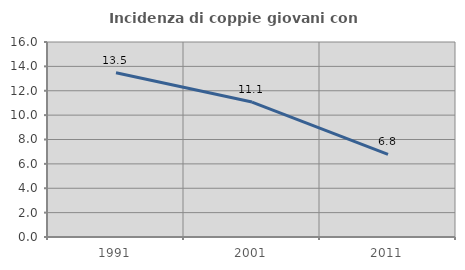
| Category | Incidenza di coppie giovani con figli |
|---|---|
| 1991.0 | 13.479 |
| 2001.0 | 11.073 |
| 2011.0 | 6.777 |